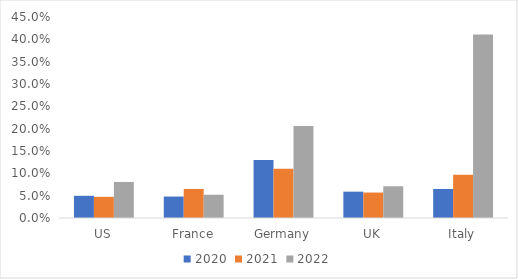
| Category | 2020 | 2021 | 2022 |
|---|---|---|---|
| US | 0.05 | 0.047 | 0.081 |
| France | 0.048 | 0.065 | 0.052 |
| Germany | 0.13 | 0.11 | 0.206 |
| UK | 0.059 | 0.057 | 0.071 |
| Italy | 0.065 | 0.097 | 0.411 |